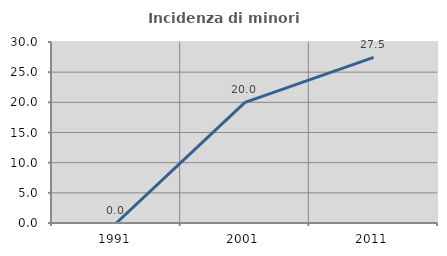
| Category | Incidenza di minori stranieri |
|---|---|
| 1991.0 | 0 |
| 2001.0 | 20 |
| 2011.0 | 27.451 |